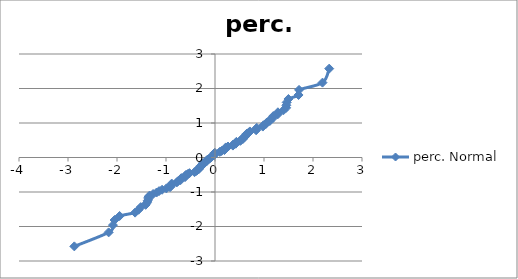
| Category | perc. Normal |
|---|---|
| -2.8706989462055095 | -2.576 |
| -2.1705278478314813 | -2.17 |
| -2.0826538831199457 | -1.96 |
| -2.050027317949586 | -1.812 |
| -1.9468285391020892 | -1.695 |
| -1.6309902738249011 | -1.598 |
| -1.5605072422382 | -1.514 |
| -1.5165458817402522 | -1.44 |
| -1.415325556770806 | -1.372 |
| -1.3880164286936458 | -1.311 |
| -1.3731870951802128 | -1.254 |
| -1.3602874183067897 | -1.2 |
| -1.3601979558598138 | -1.15 |
| -1.3355720255606292 | -1.103 |
| -1.2635041063839374 | -1.058 |
| -1.1927741329042094 | -1.015 |
| -1.1411418111056055 | -0.974 |
| -1.0798069668497958 | -0.935 |
| -0.9921296517465772 | -0.896 |
| -0.9166812705209726 | -0.86 |
| -0.897583899774675 | -0.824 |
| -0.8915342824997861 | -0.789 |
| -0.8831420071086411 | -0.755 |
| -0.7797622934586204 | -0.722 |
| -0.7601407978565529 | -0.69 |
| -0.7040045199397362 | -0.659 |
| -0.7022291071632958 | -0.628 |
| -0.6871436892051404 | -0.598 |
| -0.6103450400524073 | -0.568 |
| -0.6005148156652447 | -0.539 |
| -0.5985847590563249 | -0.51 |
| -0.559109787525295 | -0.482 |
| -0.5211321631279862 | -0.454 |
| -0.41832752546269325 | -0.426 |
| -0.39042231835332997 | -0.399 |
| -0.3663960062004 | -0.372 |
| -0.3350972307354608 | -0.345 |
| -0.3296792917933833 | -0.319 |
| -0.3134217876541978 | -0.292 |
| -0.296060206433024 | -0.266 |
| -0.28725260607766223 | -0.24 |
| -0.25123078110006436 | -0.215 |
| -0.24993383634653976 | -0.189 |
| -0.24755113520634164 | -0.164 |
| -0.19966192121036191 | -0.138 |
| -0.17344224215545173 | -0.113 |
| -0.16817136840873365 | -0.088 |
| -0.1535443773061979 | -0.063 |
| -0.12236865654817652 | -0.038 |
| -0.09846050923896618 | -0.013 |
| -0.0716749450623585 | 0.013 |
| -0.05478280157413501 | 0.038 |
| -0.0211695217112328 | 0.063 |
| -0.02023677128621474 | 0.088 |
| -0.014351098407262064 | 0.113 |
| -0.004391431513853881 | 0.138 |
| 0.09810593789370231 | 0.164 |
| 0.13466796031295192 | 0.189 |
| 0.19193749943835886 | 0.215 |
| 0.20610016976077594 | 0.24 |
| 0.21600748854638496 | 0.266 |
| 0.2201258041356649 | 0.292 |
| 0.2656255458683634 | 0.319 |
| 0.36501711362835 | 0.345 |
| 0.36723602463711114 | 0.372 |
| 0.4228376374947028 | 0.399 |
| 0.43235810835646515 | 0.426 |
| 0.4360310338903115 | 0.454 |
| 0.5139318626874723 | 0.482 |
| 0.5334010776116767 | 0.51 |
| 0.5720179092932052 | 0.539 |
| 0.573518263059853 | 0.568 |
| 0.6065729872468195 | 0.598 |
| 0.6201641181425774 | 0.628 |
| 0.6381398053331451 | 0.659 |
| 0.648490326965764 | 0.69 |
| 0.6895536717605755 | 0.722 |
| 0.7111158321823716 | 0.755 |
| 0.8394075394885565 | 0.789 |
| 0.8395806950926024 | 0.824 |
| 0.8529831172402942 | 0.86 |
| 0.9764094079620316 | 0.896 |
| 0.9891360310931456 | 0.935 |
| 1.0407681490672225 | 0.974 |
| 1.0588123012303612 | 1.015 |
| 1.11908491007032 | 1.058 |
| 1.1306818579667328 | 1.103 |
| 1.1873468976354635 | 1.15 |
| 1.189295845395927 | 1.2 |
| 1.2820530678067965 | 1.254 |
| 1.2842169898950364 | 1.311 |
| 1.3991531037554972 | 1.372 |
| 1.4522364902816753 | 1.44 |
| 1.455968145676359 | 1.514 |
| 1.4627492535236142 | 1.598 |
| 1.4988753787897893 | 1.695 |
| 1.7052617881875731 | 1.812 |
| 1.7155943066720547 | 1.96 |
| 2.193640780485591 | 2.17 |
| 2.330821211777895 | 2.576 |